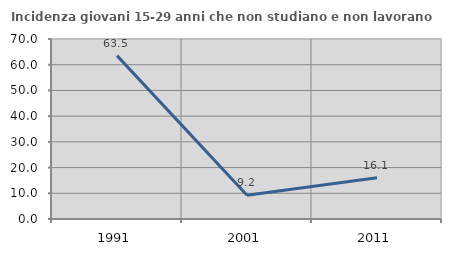
| Category | Incidenza giovani 15-29 anni che non studiano e non lavorano  |
|---|---|
| 1991.0 | 63.528 |
| 2001.0 | 9.232 |
| 2011.0 | 16.061 |